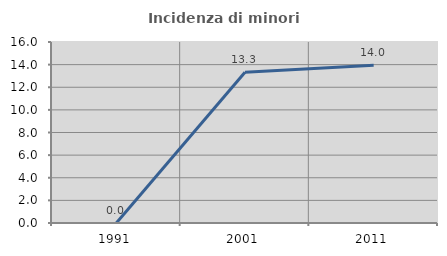
| Category | Incidenza di minori stranieri |
|---|---|
| 1991.0 | 0 |
| 2001.0 | 13.333 |
| 2011.0 | 13.953 |